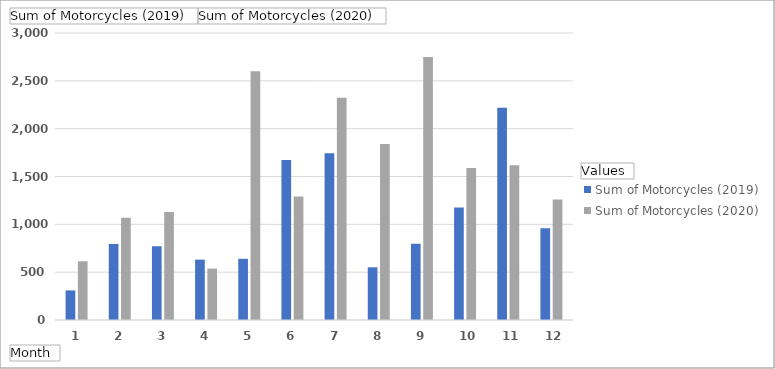
| Category | Sum of Motorcycles (2019) | Sum of Motorcycles (2020) |
|---|---|---|
| 1 | 309 | 614 |
| 2 | 795 | 1069 |
| 3 | 771 | 1129 |
| 4 | 631 | 537 |
| 5 | 640 | 2601 |
| 6 | 1672 | 1292 |
| 7 | 1743 | 2323 |
| 8 | 551 | 1841 |
| 9 | 797 | 2749 |
| 10 | 1177 | 1588 |
| 11 | 2219 | 1617 |
| 12 | 958 | 1260 |